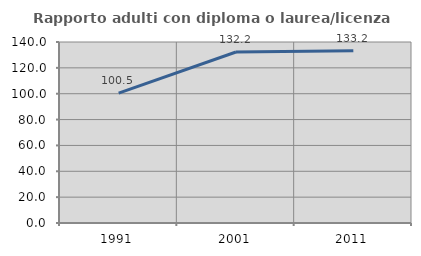
| Category | Rapporto adulti con diploma o laurea/licenza media  |
|---|---|
| 1991.0 | 100.498 |
| 2001.0 | 132.245 |
| 2011.0 | 133.216 |